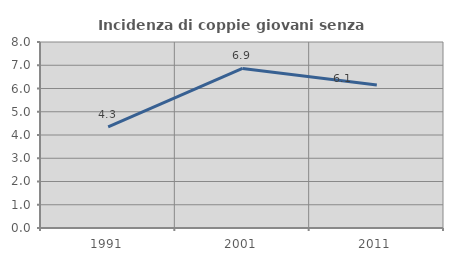
| Category | Incidenza di coppie giovani senza figli |
|---|---|
| 1991.0 | 4.348 |
| 2001.0 | 6.863 |
| 2011.0 | 6.149 |